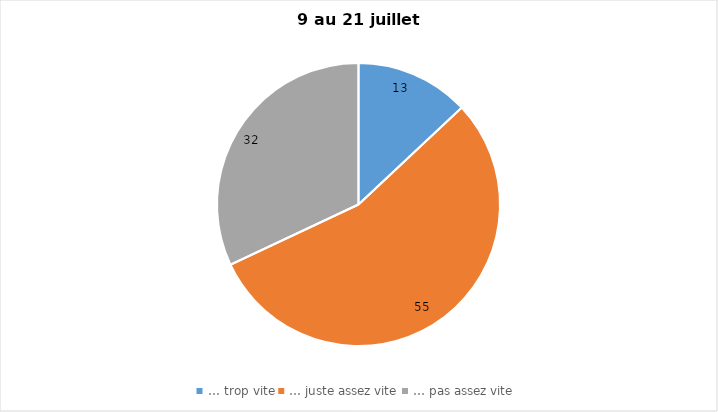
| Category | Series 0 |
|---|---|
| … trop vite | 13 |
| … juste assez vite | 55 |
| … pas assez vite | 32 |